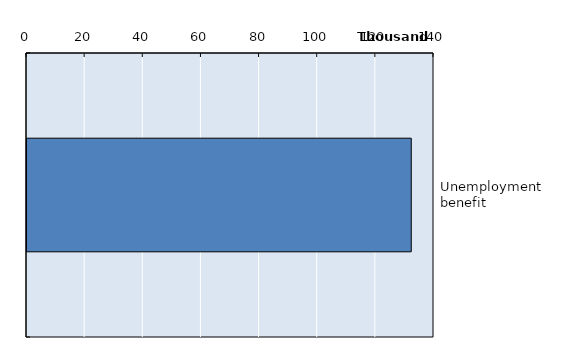
| Category | Series 0 |
|---|---|
| Unemployment benefit | 132175 |